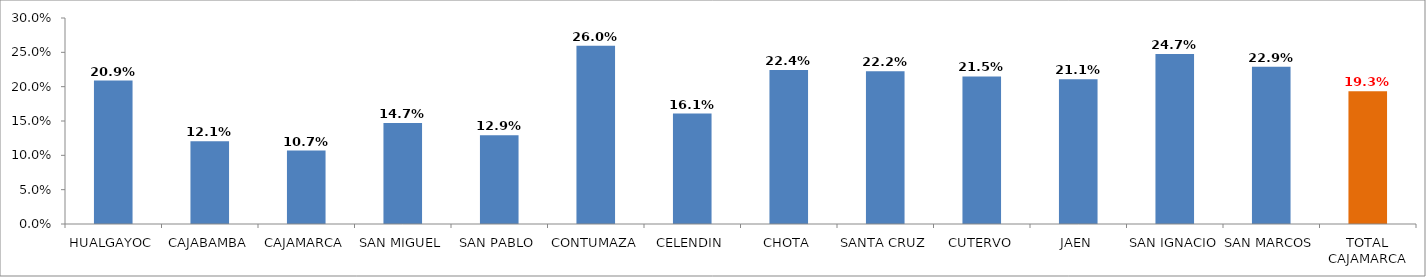
| Category | % AFILIADAS CON CONSEJERÍA EN PPFF 
(QUINTIL 1 y 2) |
|---|---|
| HUALGAYOC | 0.209 |
| CAJABAMBA | 0.121 |
| CAJAMARCA | 0.107 |
| SAN MIGUEL | 0.147 |
| SAN PABLO | 0.129 |
| CONTUMAZA | 0.26 |
| CELENDIN | 0.161 |
| CHOTA | 0.224 |
| SANTA CRUZ | 0.222 |
| CUTERVO | 0.215 |
| JAEN | 0.211 |
| SAN IGNACIO | 0.247 |
| SAN MARCOS | 0.229 |
| TOTAL CAJAMARCA | 0.193 |